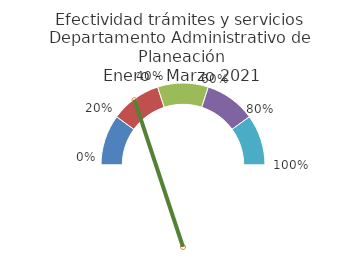
| Category | 2.032748104 |
|---|---|
| 0.0 | 0.2 |
| 0.2 | 0.2 |
| 0.4 | 0.2 |
| 0.6 | 0.2 |
| 0.8 | 0.2 |
| 1.0 | 1 |